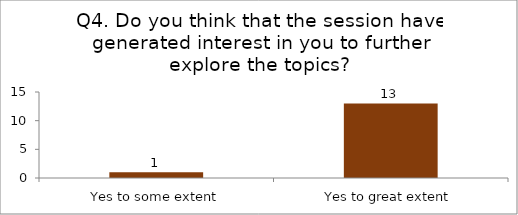
| Category | Q4. Do you think that the session have generated interest in you to further explore the topics? |
|---|---|
| Yes to some extent | 1 |
| Yes to great extent | 13 |